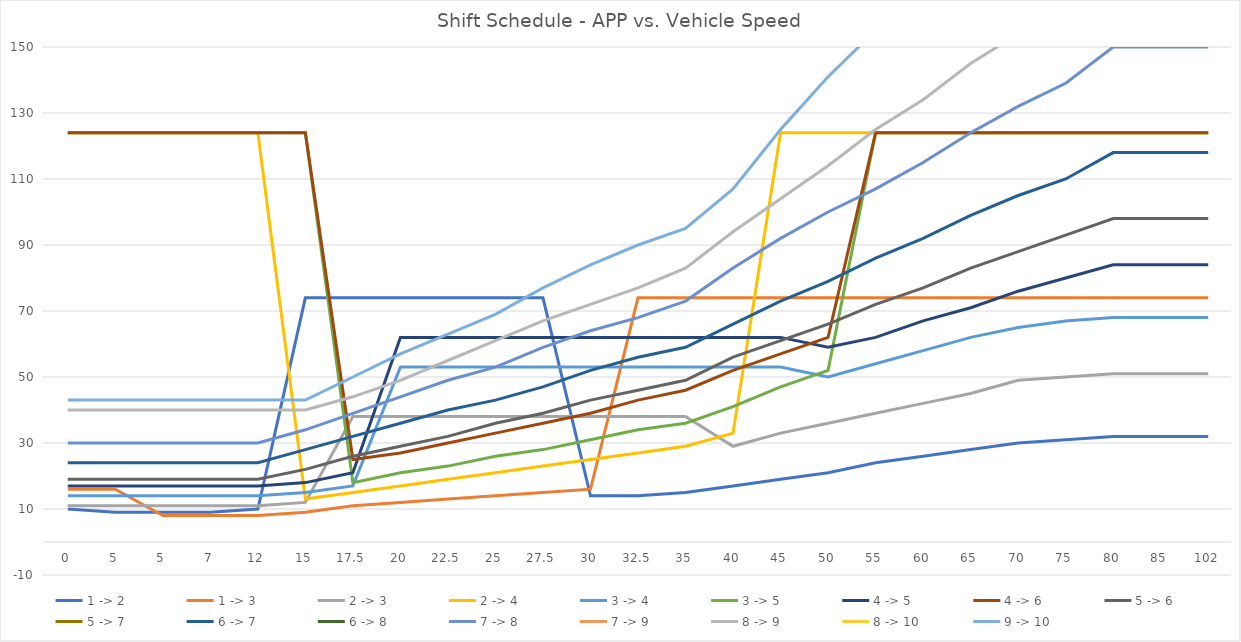
| Category | 1 -> 2 | 1 -> 3 | 2 -> 3 | 2 -> 4 | 3 -> 4 | 3 -> 5 | 4 -> 5 | 4 -> 6 | 5 -> 6 | 5 -> 7 | 6 -> 7 | 6 -> 8 | 7 -> 8 | 7 -> 9 | 8 -> 9 | 8 -> 10 | 9 -> 10 |
|---|---|---|---|---|---|---|---|---|---|---|---|---|---|---|---|---|---|
| 0.0 | 10 | 16 | 11 | 124 | 14 | 124 | 17 | 124 | 19 | 174 | 24 | 174 | 30 | 174 | 40 | 174 | 43 |
| 5.0 | 9 | 16 | 11 | 124 | 14 | 124 | 17 | 124 | 19 | 174 | 24 | 174 | 30 | 174 | 40 | 174 | 43 |
| 5.0 | 9 | 8 | 11 | 124 | 14 | 124 | 17 | 124 | 19 | 174 | 24 | 174 | 30 | 174 | 40 | 174 | 43 |
| 7.0 | 9 | 8 | 11 | 124 | 14 | 124 | 17 | 124 | 19 | 174 | 24 | 174 | 30 | 174 | 40 | 174 | 43 |
| 12.0 | 10 | 8 | 11 | 124 | 14 | 124 | 17 | 124 | 19 | 174 | 24 | 174 | 30 | 174 | 40 | 174 | 43 |
| 15.0 | 74 | 9 | 12 | 13 | 15 | 124 | 18 | 124 | 22 | 174 | 28 | 174 | 34 | 174 | 40 | 174 | 43 |
| 17.5 | 74 | 11 | 38 | 15 | 17 | 18 | 21 | 25 | 26 | 174 | 32 | 174 | 39 | 174 | 44 | 174 | 50 |
| 20.0 | 74 | 12 | 38 | 17 | 53 | 21 | 62 | 27 | 29 | 174 | 36 | 174 | 44 | 174 | 49 | 174 | 57 |
| 22.5 | 74 | 13 | 38 | 19 | 53 | 23 | 62 | 30 | 32 | 174 | 40 | 174 | 49 | 174 | 55 | 174 | 63 |
| 25.0 | 74 | 14 | 38 | 21 | 53 | 26 | 62 | 33 | 36 | 174 | 43 | 174 | 53 | 174 | 61 | 174 | 69 |
| 27.5 | 74 | 15 | 38 | 23 | 53 | 28 | 62 | 36 | 39 | 174 | 47 | 174 | 59 | 174 | 67 | 174 | 77 |
| 30.0 | 14 | 16 | 38 | 25 | 53 | 31 | 62 | 39 | 43 | 174 | 52 | 174 | 64 | 174 | 72 | 174 | 84 |
| 32.5 | 14 | 74 | 38 | 27 | 53 | 34 | 62 | 43 | 46 | 174 | 56 | 174 | 68 | 174 | 77 | 174 | 90 |
| 35.0 | 15 | 74 | 38 | 29 | 53 | 36 | 62 | 46 | 49 | 174 | 59 | 174 | 73 | 174 | 83 | 174 | 95 |
| 40.0 | 17 | 74 | 29 | 33 | 53 | 41 | 62 | 52 | 56 | 174 | 66 | 174 | 83 | 174 | 94 | 174 | 107 |
| 45.0 | 19 | 74 | 33 | 124 | 53 | 47 | 62 | 57 | 61 | 174 | 73 | 174 | 92 | 174 | 104 | 174 | 125 |
| 50.0 | 21 | 74 | 36 | 124 | 50 | 52 | 59 | 62 | 66 | 174 | 79 | 174 | 100 | 174 | 114 | 174 | 141 |
| 55.0 | 24 | 74 | 39 | 124 | 54 | 124 | 62 | 124 | 72 | 174 | 86 | 174 | 107 | 174 | 125 | 174 | 155 |
| 60.0 | 26 | 74 | 42 | 124 | 58 | 124 | 67 | 124 | 77 | 174 | 92 | 174 | 115 | 174 | 134 | 174 | 166 |
| 65.0 | 28 | 74 | 45 | 124 | 62 | 124 | 71 | 124 | 83 | 174 | 99 | 174 | 124 | 174 | 145 | 174 | 179 |
| 70.0 | 30 | 74 | 49 | 124 | 65 | 124 | 76 | 124 | 88 | 174 | 105 | 174 | 132 | 174 | 154 | 174 | 189 |
| 75.0 | 31 | 74 | 50 | 124 | 67 | 124 | 80 | 124 | 93 | 174 | 110 | 174 | 139 | 174 | 163 | 174 | 199 |
| 80.0 | 32 | 74 | 51 | 124 | 68 | 124 | 84 | 124 | 98 | 174 | 118 | 174 | 150 | 174 | 175 | 174 | 216 |
| 85.0 | 32 | 74 | 51 | 124 | 68 | 124 | 84 | 124 | 98 | 174 | 118 | 174 | 150 | 174 | 175 | 174 | 216 |
| 102.0 | 32 | 74 | 51 | 124 | 68 | 124 | 84 | 124 | 98 | 174 | 118 | 174 | 150 | 174 | 175 | 174 | 216 |